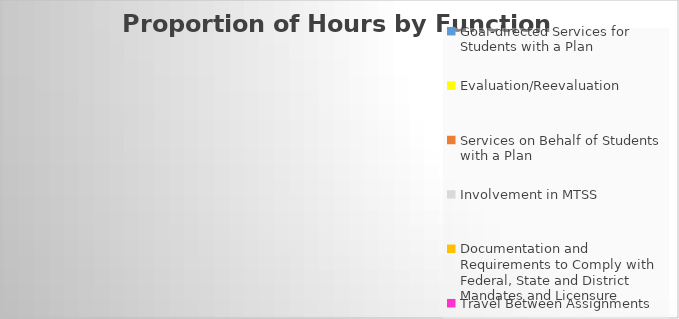
| Category | Series 0 |
|---|---|
| Goal-directed Services for Students with a Plan | 0 |
| Evaluation/Reevaluation | 0 |
| Services on Behalf of Students with a Plan | 0 |
| Involvement in MTSS | 0 |
| Documentation and Requirements to Comply with Federal, State and District Mandates and Licensure
 | 0 |
| Travel Between Assignments | 0 |
| Other Activities | 0 |